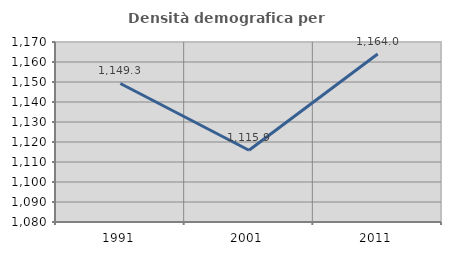
| Category | Densità demografica |
|---|---|
| 1991.0 | 1149.262 |
| 2001.0 | 1115.891 |
| 2011.0 | 1164.025 |